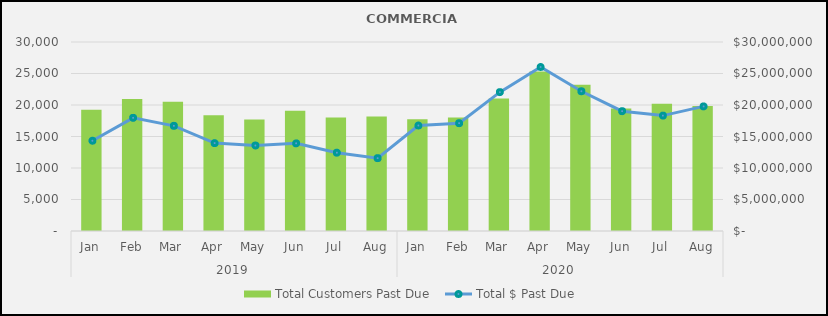
| Category | Total Customers Past Due  |
|---|---|
| 0 | 19250 |
| 1 | 20955 |
| 2 | 20531 |
| 3 | 18377 |
| 4 | 17711 |
| 5 | 19074 |
| 6 | 18033 |
| 7 | 18185 |
| 8 | 17731 |
| 9 | 18032 |
| 10 | 21046 |
| 11 | 25308 |
| 12 | 23196 |
| 13 | 19458 |
| 14 | 20192 |
| 15 | 19854 |